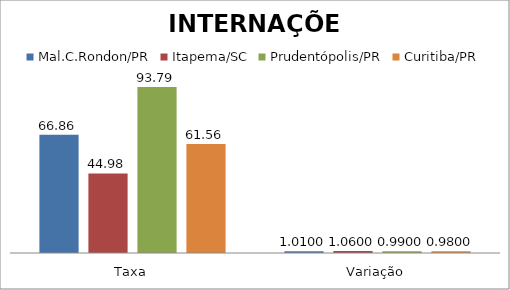
| Category | Mal.C.Rondon/PR | Itapema/SC | Prudentópolis/PR | Toledo/PR | Cascavel/PR | Curitiba/PR |
|---|---|---|---|---|---|---|
| Taxa | 66.86 | 44.98 | 93.79 |  |  | 61.56 |
| Variação | 1.01 | 1.06 | 0.99 |  |  | 0.98 |